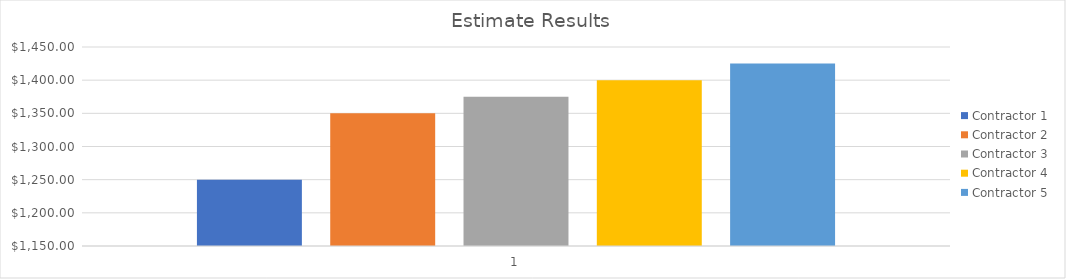
| Category | Contractor 1 | Contractor 2 | Contractor 3 | Contractor 4 | Contractor 5 |
|---|---|---|---|---|---|
| 0 | 1250 | 1350 | 1375 | 1400 | 1425 |